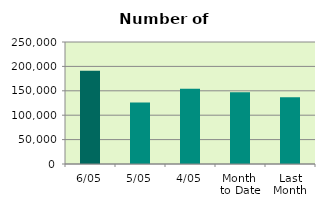
| Category | Series 0 |
|---|---|
| 6/05 | 191188 |
| 5/05 | 125872 |
| 4/05 | 153988 |
| Month 
to Date | 146793 |
| Last
Month | 137031.8 |